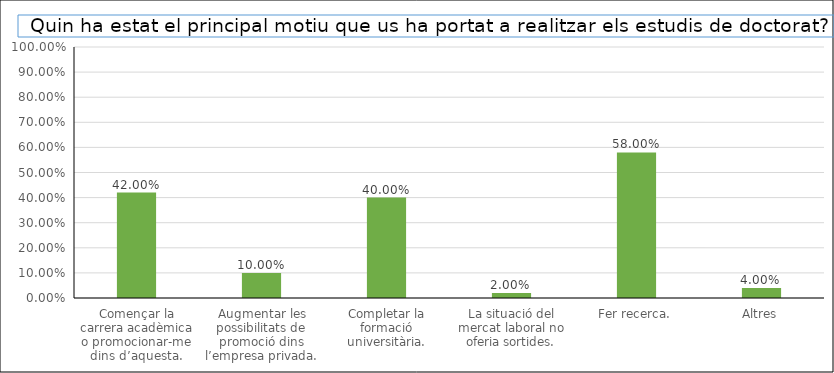
| Category | Series 0 |
|---|---|
| Començar la carrera acadèmica o promocionar-me dins d’aquesta. | 0.42 |
| Augmentar les possibilitats de promoció dins l’empresa privada. | 0.1 |
| Completar la formació universitària. | 0.4 |
| La situació del mercat laboral no oferia sortides. | 0.02 |
| Fer recerca. | 0.58 |
| Altres | 0.04 |